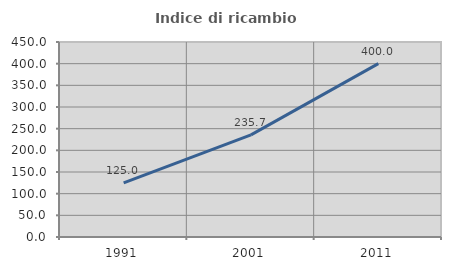
| Category | Indice di ricambio occupazionale  |
|---|---|
| 1991.0 | 125 |
| 2001.0 | 235.714 |
| 2011.0 | 400 |